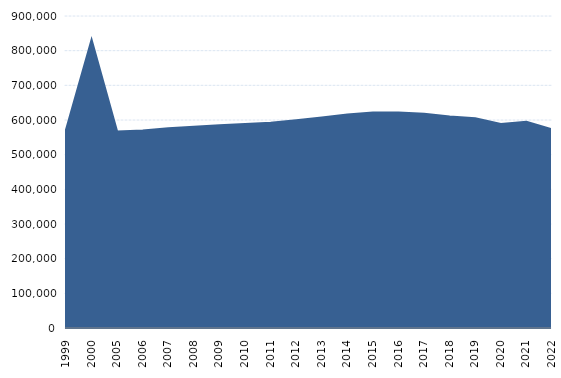
| Category | Series 1 |
|---|---|
| 1999.0 | 571874 |
| 2000.0 | 831900 |
| 2005.0 | 567000 |
| 2006.0 | 569600 |
| 2007.0 | 576100 |
| 2008.0 | 580598 |
| 2009.0 | 584714 |
| 2010.0 | 588276 |
| 2011.0 | 592281 |
| 2012.0 | 599333 |
| 2013.0 | 606897 |
| 2014.0 | 615573 |
| 2015.0 | 621777 |
| 2016.0 | 621986 |
| 2017.0 | 618214 |
| 2018.0 | 610206 |
| 2019.0 | 605300 |
| 2020.0 | 588600 |
| 2021.0 | 595200 |
| 2022.0 | 573000 |